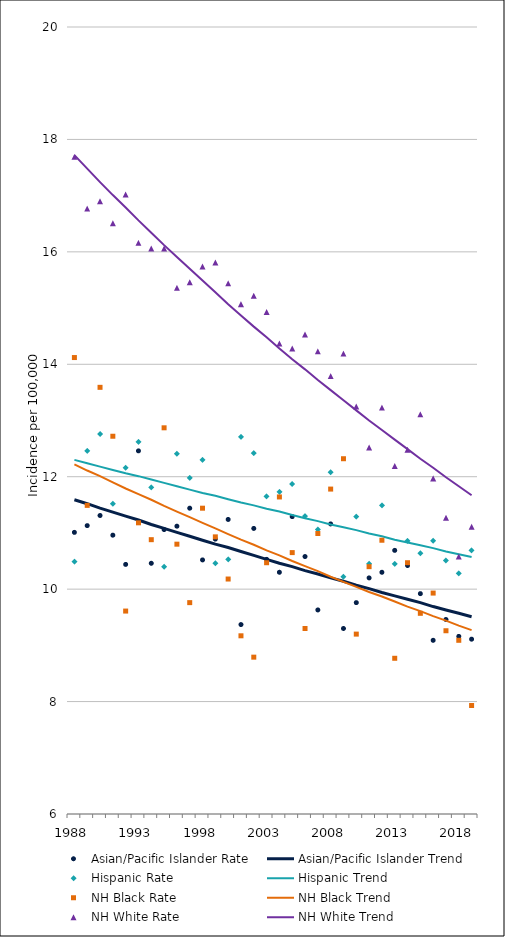
| Category | Asian/Pacific Islander Rate | Asian/Pacific Islander Trend | Hispanic Rate | Hispanic Trend | NH Black Rate | NH Black Trend | NH White Rate | NH White Trend |
|---|---|---|---|---|---|---|---|---|
| 1988.0 | 11.01 | 11.59 | 10.49 | 12.3 | 14.12 | 12.22 | 17.69 | 17.72 |
| 1989.0 | 11.13 | 11.52 | 12.46 | 12.24 | 11.49 | 12.11 | 16.77 | 17.48 |
| 1990.0 | 11.31 | 11.44 | 12.76 | 12.18 | 13.59 | 12.01 | 16.9 | 17.24 |
| 1991.0 | 10.96 | 11.37 | 11.52 | 12.12 | 12.72 | 11.9 | 16.51 | 17.01 |
| 1992.0 | 10.44 | 11.3 | 12.16 | 12.06 | 9.61 | 11.79 | 17.02 | 16.79 |
| 1993.0 | 12.46 | 11.23 | 12.62 | 12.01 | 11.18 | 11.69 | 16.16 | 16.56 |
| 1994.0 | 10.46 | 11.15 | 11.81 | 11.95 | 10.88 | 11.59 | 16.06 | 16.34 |
| 1995.0 | 11.06 | 11.08 | 10.4 | 11.89 | 12.87 | 11.48 | 16.06 | 16.12 |
| 1996.0 | 11.12 | 11.01 | 12.41 | 11.83 | 10.8 | 11.38 | 15.36 | 15.91 |
| 1997.0 | 11.44 | 10.94 | 11.98 | 11.77 | 9.76 | 11.28 | 15.46 | 15.7 |
| 1998.0 | 10.52 | 10.87 | 12.3 | 11.71 | 11.44 | 11.18 | 15.74 | 15.49 |
| 1999.0 | 10.89 | 10.8 | 10.46 | 11.66 | 10.93 | 11.08 | 15.81 | 15.28 |
| 2000.0 | 11.24 | 10.74 | 10.53 | 11.6 | 10.18 | 10.98 | 15.44 | 15.07 |
| 2001.0 | 9.37 | 10.67 | 12.71 | 11.54 | 9.17 | 10.88 | 15.07 | 14.87 |
| 2002.0 | 11.08 | 10.6 | 12.42 | 11.49 | 8.79 | 10.79 | 15.22 | 14.67 |
| 2003.0 | 10.53 | 10.53 | 11.65 | 11.43 | 10.47 | 10.69 | 14.93 | 14.48 |
| 2004.0 | 10.3 | 10.46 | 11.73 | 11.38 | 11.64 | 10.6 | 14.37 | 14.28 |
| 2005.0 | 11.29 | 10.4 | 11.87 | 11.32 | 10.65 | 10.5 | 14.28 | 14.09 |
| 2006.0 | 10.58 | 10.33 | 11.3 | 11.26 | 9.3 | 10.41 | 14.53 | 13.91 |
| 2007.0 | 9.63 | 10.27 | 11.06 | 11.21 | 10.99 | 10.32 | 14.23 | 13.72 |
| 2008.0 | 11.16 | 10.2 | 12.08 | 11.15 | 11.78 | 10.22 | 13.79 | 13.54 |
| 2009.0 | 9.3 | 10.14 | 10.22 | 11.1 | 12.32 | 10.13 | 14.19 | 13.36 |
| 2010.0 | 9.76 | 10.07 | 11.29 | 11.05 | 9.2 | 10.04 | 13.25 | 13.18 |
| 2011.0 | 10.2 | 10.01 | 10.45 | 10.99 | 10.4 | 9.95 | 12.52 | 13 |
| 2012.0 | 10.3 | 9.94 | 11.49 | 10.94 | 10.87 | 9.87 | 13.23 | 12.83 |
| 2013.0 | 10.69 | 9.88 | 10.45 | 10.88 | 8.77 | 9.78 | 12.19 | 12.66 |
| 2014.0 | 10.42 | 9.82 | 10.86 | 10.83 | 10.47 | 9.69 | 12.48 | 12.49 |
| 2015.0 | 9.92 | 9.76 | 10.64 | 10.78 | 9.57 | 9.61 | 13.11 | 12.32 |
| 2016.0 | 9.09 | 9.69 | 10.86 | 10.73 | 9.93 | 9.52 | 11.97 | 12.16 |
| 2017.0 | 9.46 | 9.63 | 10.51 | 10.67 | 9.26 | 9.44 | 11.27 | 11.99 |
| 2018.0 | 9.16 | 9.57 | 10.28 | 10.62 | 9.09 | 9.35 | 10.58 | 11.83 |
| 2019.0 | 9.11 | 9.51 | 10.69 | 10.57 | 7.93 | 9.27 | 11.11 | 11.67 |